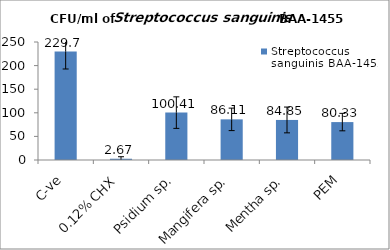
| Category | Streptococcus sanguinis BAA-1455 |
|---|---|
| C-ve | 229.7 |
| 0.12% CHX | 2.67 |
| Psidium sp. | 100.41 |
| Mangifera sp. | 86.11 |
| Mentha sp. | 84.85 |
| PEM | 80.33 |